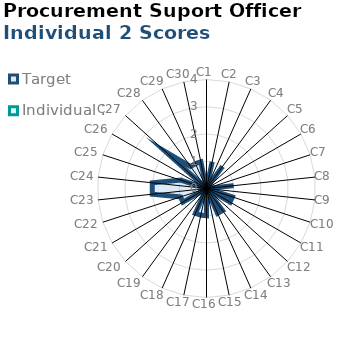
| Category | Target | Individual 2 |
|---|---|---|
| C1 | 0 | 0 |
| C2 | 1 | 0 |
| C3 | 0 | 0 |
| C4 | 1 | 0 |
| C5 | 0 | 0 |
| C6 | 0 | 0 |
| C7 | 0 | 0 |
| C8 | 1 | 0 |
| C9 | 0 | 0 |
| C10 | 1 | 0 |
| C11 | 1 | 0 |
| C12 | 0 | 0 |
| C13 | 1 | 0 |
| C14 | 1 | 0 |
| C15 | 0 | 0 |
| C16 | 1 | 0 |
| C17 | 1 | 0 |
| C18 | 1 | 0 |
| C19 | 0 | 0 |
| C20 | 0 | 0 |
| C21 | 1 | 0 |
| C22 | 1 | 0 |
| C23 | 2 | 0 |
| C24 | 2 | 0 |
| C25 | 1 | 0 |
| C26 | 0 | 0 |
| C27 | 2 | 0 |
| C28 | 1 | 0 |
| C29 | 1 | 0 |
| C30 | 1 | 0 |